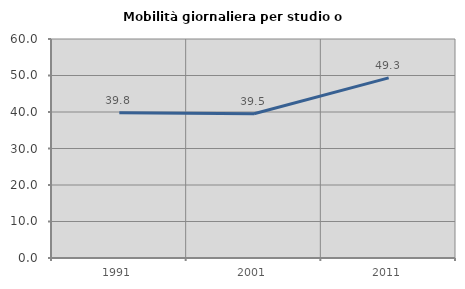
| Category | Mobilità giornaliera per studio o lavoro |
|---|---|
| 1991.0 | 39.803 |
| 2001.0 | 39.504 |
| 2011.0 | 49.336 |